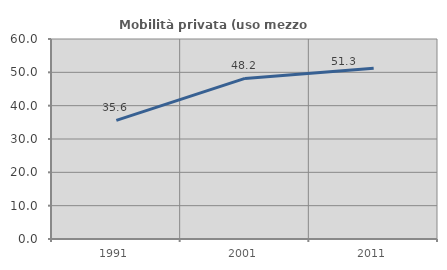
| Category | Mobilità privata (uso mezzo privato) |
|---|---|
| 1991.0 | 35.606 |
| 2001.0 | 48.182 |
| 2011.0 | 51.25 |